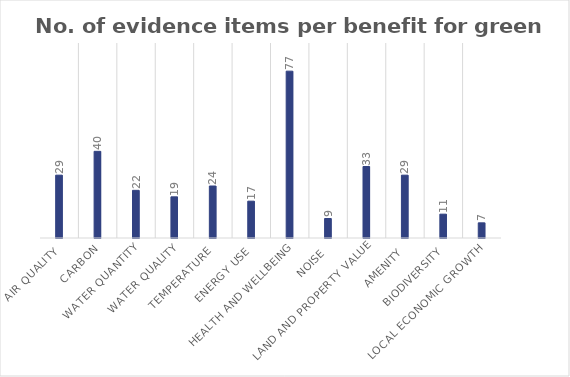
| Category | No. of evidence items |
|---|---|
| Air quality | 29 |
| Carbon | 40 |
| Water quantity | 22 |
| Water quality | 19 |
| Temperature | 24 |
| Energy use | 17 |
| Health and wellbeing | 77 |
| Noise | 9 |
| Land and property value | 33 |
| Amenity | 29 |
| Biodiversity | 11 |
| Local economic growth | 7 |